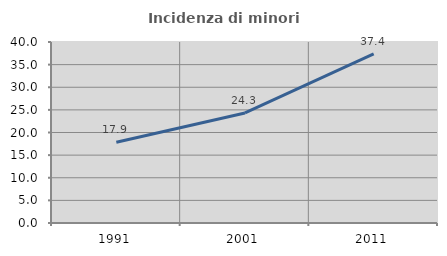
| Category | Incidenza di minori stranieri |
|---|---|
| 1991.0 | 17.857 |
| 2001.0 | 24.324 |
| 2011.0 | 37.397 |